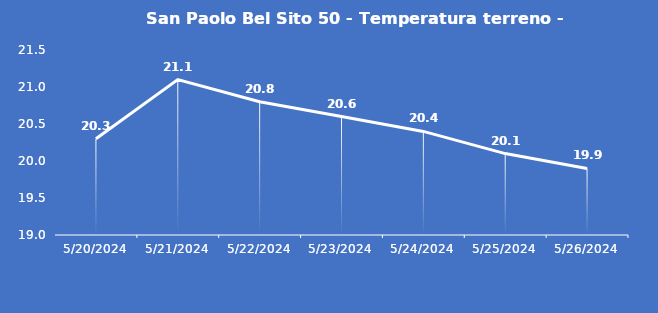
| Category | San Paolo Bel Sito 50 - Temperatura terreno - Grezzo (°C) |
|---|---|
| 5/20/24 | 20.3 |
| 5/21/24 | 21.1 |
| 5/22/24 | 20.8 |
| 5/23/24 | 20.6 |
| 5/24/24 | 20.4 |
| 5/25/24 | 20.1 |
| 5/26/24 | 19.9 |